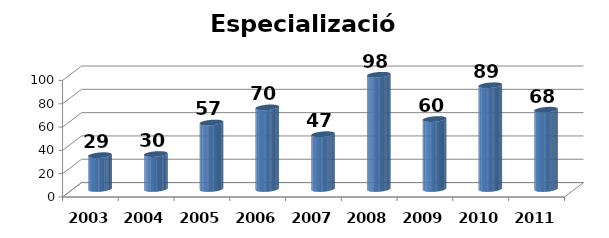
| Category | Especialización |
|---|---|
| 2003.0 | 29 |
| 2004.0 | 30 |
| 2005.0 | 57 |
| 2006.0 | 70 |
| 2007.0 | 47 |
| 2008.0 | 98 |
| 2009.0 | 60 |
| 2010.0 | 89 |
| 2011.0 | 68 |